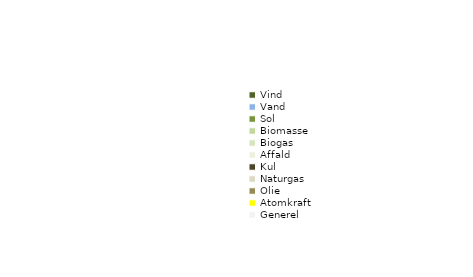
| Category | Series 0 | Series 1 |
|---|---|---|
| Vind | 0 |  |
| Vand | 0 |  |
| Sol | 0 |  |
| Biomasse | 0 |  |
| Biogas | 0 |  |
| Affald | 0 |  |
| Kul | 0 |  |
| Naturgas | 0 |  |
| Olie | 0 |  |
| Atomkraft | 0 |  |
| Generel | 0 |  |